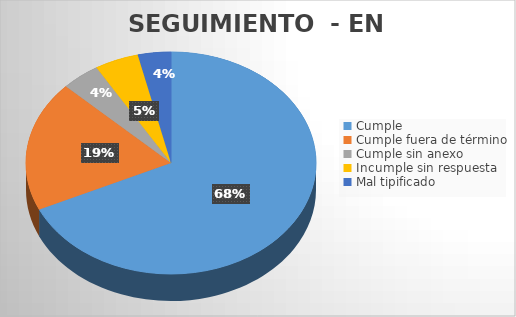
| Category | TOTAL |
|---|---|
| Cumple | 111 |
| Cumple fuera de término | 31 |
| Cumple sin anexo | 7 |
| Incumple sin respuesta | 8 |
| Mal tipificado | 6 |